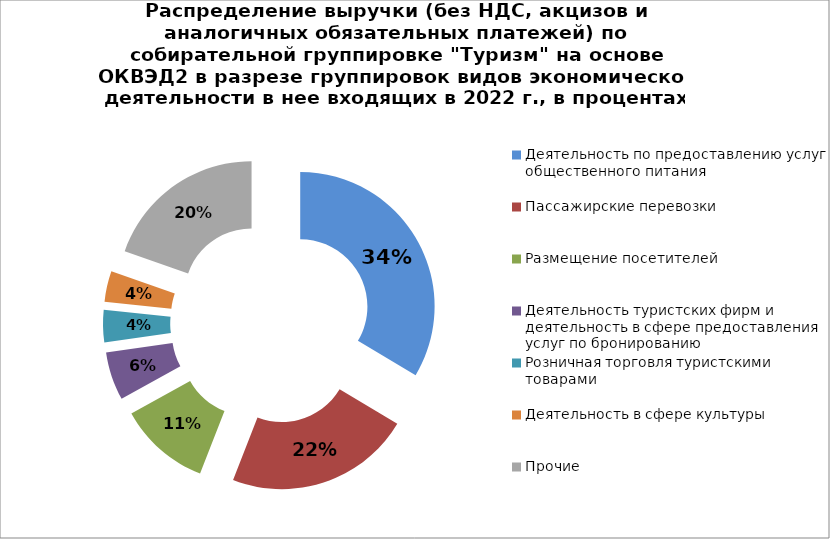
| Category | Series 0 |
|---|---|
| Деятельность по предоставлению услуг общественного питания | 33.567 |
| Пассажирские перевозки | 22.35 |
| Размещение посетителей | 11.026 |
| Деятельность туристских фирм и деятельность в сфере предоставления услуг по бронированию | 5.821 |
| Розничная торговля туристскими товарами | 3.883 |
| Деятельность в сфере культуры | 3.709 |
| Прочие | 19.643 |